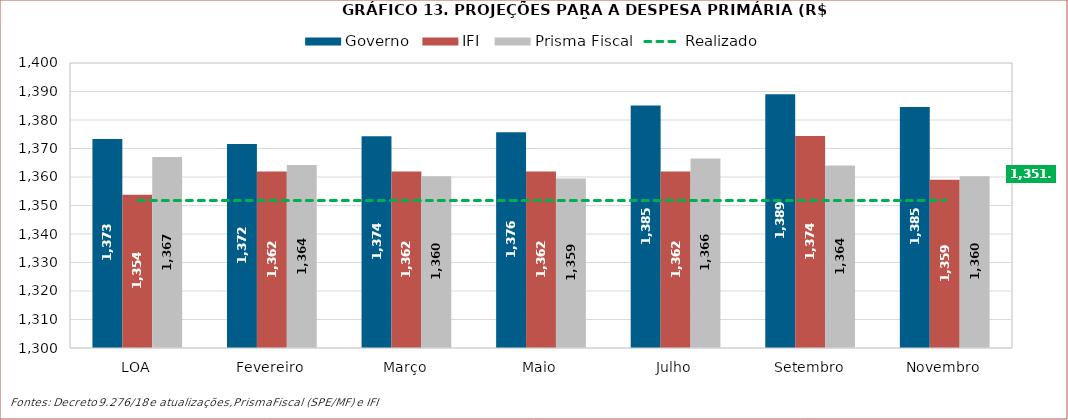
| Category | Governo | IFI | Prisma Fiscal |
|---|---|---|---|
| LOA | 1373.365 | 1353.76 | 1367.017 |
| Fevereiro | 1371.598 | 1361.937 | 1364.188 |
| Março | 1374.296 | 1361.937 | 1360.237 |
| Maio | 1375.719 | 1361.935 | 1359.486 |
| Julho | 1385.11 | 1361.935 | 1366.496 |
| Setembro | 1389.039 | 1374.366 | 1364 |
| Novembro | 1384.568 | 1359.043 | 1360.246 |